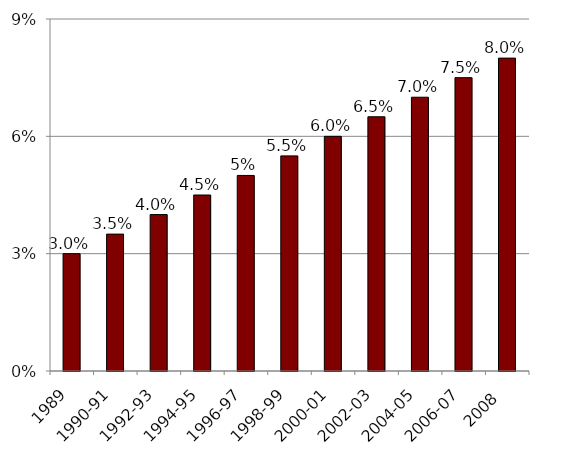
| Category | Series 0 |
|---|---|
| 1989 | 0.03 |
| 1990-91 | 0.035 |
| 1992-93 | 0.04 |
| 1994-95 | 0.045 |
| 1996-97 | 0.05 |
| 1998-99 | 0.055 |
| 2000-01 | 0.06 |
| 2002-03 | 0.065 |
| 2004-05 | 0.07 |
| 2006-07 | 0.075 |
| 2008  | 0.08 |